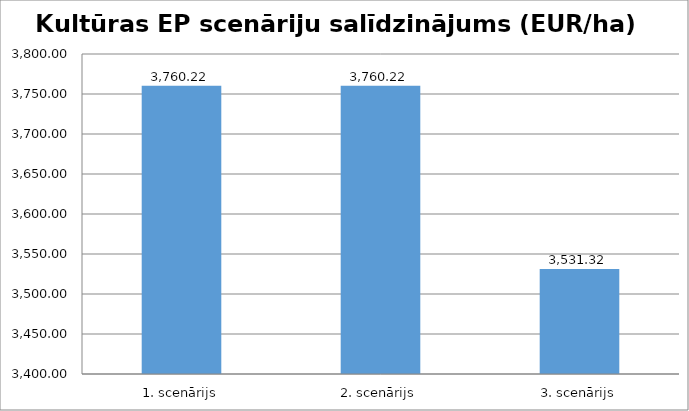
| Category | 1. scenārijs |
|---|---|
| 1. scenārijs | 3760.216 |
| 2. scenārijs | 3760.216 |
| 3. scenārijs | 3531.316 |